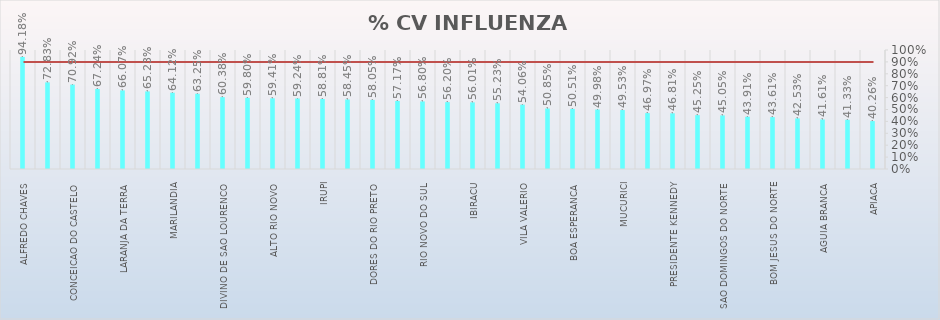
| Category | % CV INFLUENZA |
|---|---|
| ALFREDO CHAVES | 0.942 |
| BREJETUBA | 0.728 |
| CONCEICAO DO CASTELO | 0.709 |
| ITAGUACU | 0.672 |
| LARANJA DA TERRA | 0.661 |
| MUQUI | 0.652 |
| MARILANDIA | 0.641 |
| GOVERNADOR LINDENBERG | 0.632 |
| DIVINO DE SAO LOURENCO | 0.604 |
| SAO ROQUE DO CANAA | 0.598 |
| ALTO RIO NOVO | 0.594 |
| JOAO NEIVA | 0.592 |
| IRUPI | 0.588 |
| PONTO BELO | 0.584 |
| DORES DO RIO PRETO | 0.581 |
| ITARANA | 0.572 |
| RIO NOVO DO SUL | 0.568 |
| ICONHA | 0.562 |
| IBIRACU | 0.56 |
| JERONIMO MONTEIRO | 0.552 |
| VILA VALERIO | 0.541 |
| VILA PAVAO | 0.509 |
| BOA ESPERANCA | 0.505 |
| ATILIO VIVACQUA | 0.5 |
| MUCURICI | 0.495 |
| SANTA LEOPOLDINA | 0.47 |
| PRESIDENTE KENNEDY | 0.468 |
| SAO JOSE DO CALCADO | 0.452 |
| SAO DOMINGOS DO NORTE | 0.451 |
| MANTENOPOLIS | 0.439 |
| BOM JESUS DO NORTE | 0.436 |
| IBITIRAMA | 0.425 |
| AGUIA BRANCA | 0.416 |
| AGUA DOCE DO NORTE | 0.413 |
| APIACA | 0.403 |